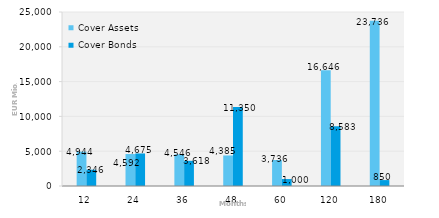
| Category | Cover Assets | Cover Bonds |
|---|---|---|
| 12.0 | 4943.853 | 2346.333 |
| 24.0 | 4591.978 | 4675 |
| 36.0 | 4545.838 | 3617.592 |
| 48.0 | 4385.012 | 11350 |
| 60.0 | 3735.818 | 1000 |
| 120.0 | 16645.789 | 8582.8 |
| 180.0 | 23735.972 | 850 |